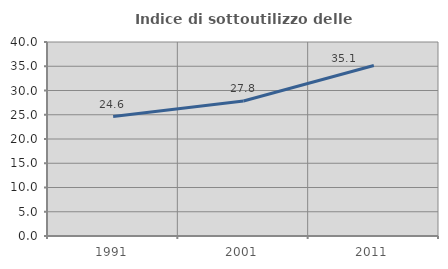
| Category | Indice di sottoutilizzo delle abitazioni  |
|---|---|
| 1991.0 | 24.621 |
| 2001.0 | 27.839 |
| 2011.0 | 35.148 |